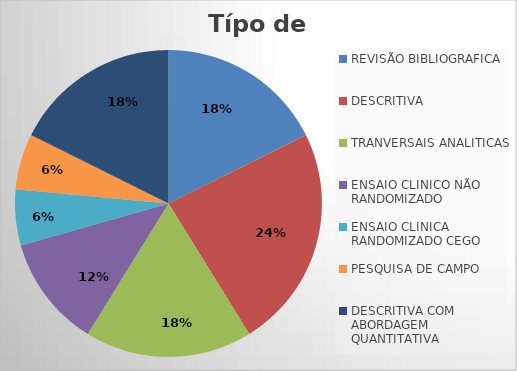
| Category | Series 0 |
|---|---|
| REVISÃO BIBLIOGRAFICA | 3 |
| DESCRITIVA | 4 |
| TRANVERSAIS ANALITICAS | 3 |
| ENSAIO CLINICO NÃO RANDOMIZADO | 2 |
| ENSAIO CLINICA RANDOMIZADO CEGO | 1 |
| PESQUISA DE CAMPO | 1 |
| DESCRITIVA COM ABORDAGEM QUANTITATIVA | 3 |